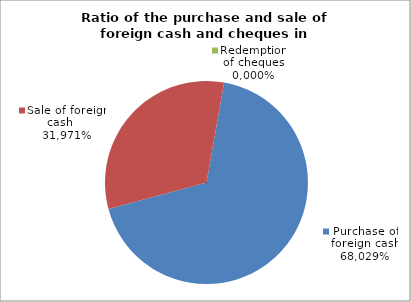
| Category | Purchase of foreign cash |
|---|---|
| 0 | 0.68 |
| 1 | 0.32 |
| 2 | 0 |